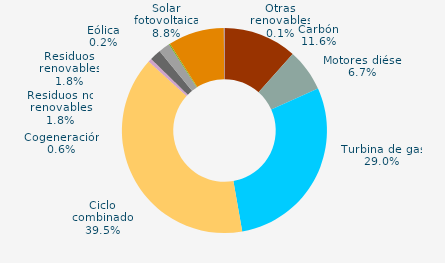
| Category | Series 0 |
|---|---|
| Carbón | 11.581 |
| Motores diésel | 6.693 |
| Turbina de gas | 28.958 |
| Ciclo combinado | 39.511 |
| Generación auxiliar | 0 |
| Cogeneración | 0.553 |
| Residuos no renovables | 1.796 |
| Residuos renovables | 1.796 |
| Eólica | 0.173 |
| Solar fotovoltaica | 8.836 |
| Otras renovables | 0.102 |